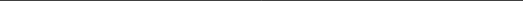
| Category | Доля пред-ий с РП < 0% | Доля предп-ий с 0<РП<20% | Доля пред-ий с 20%<РП<40% | Доля предп-ий с РП > 40% |
|---|---|---|---|---|
| 2 -тоқ.  | 16.39 | 12.55 | 41.146 | 29.398 |
| 3 -тоқ. | 14.325 | 12.309 | 42.702 | 30.011 |
| 4 -тоқ. | 15.902 | 11.992 | 42.231 | 29.353 |
| 1 -тоқ. 2010  | 17.254 | 12.099 | 40.295 | 30.142 |